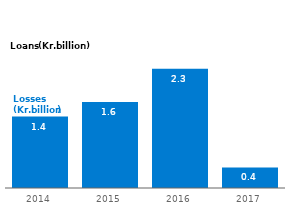
| Category | Losses |
|---|---|
| 2014.0 | 1.363 |
| 2015.0 | 1.64 |
| 2016.0 | 2.277 |
| 2017.0 | 0.392 |